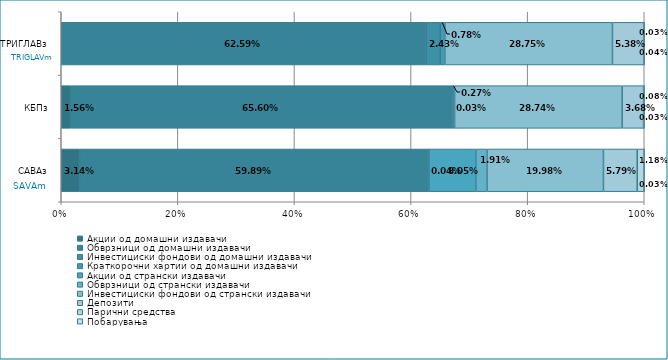
| Category | Акции од домашни издавачи  | Обврзници од домашни издавачи  | Инвестициски фондови од домашни издавачи  | Краткорочни хартии од домашни издавачи  | Акции од странски издавачи  | Обврзници од странски издавачи  | Инвестициски фондови од странски издавaчи | Депозити  | Парични средства  | Побарувања |
|---|---|---|---|---|---|---|---|---|---|---|
| САВАз | 0.031 | 0.599 | 0 | 0 | 0.08 | 0.019 | 0.2 | 0.058 | 0.012 | 0 |
| КБПз | 0.016 | 0.656 | 0 | 0 | 0 | 0.003 | 0.287 | 0.037 | 0.001 | 0 |
| ТРИГЛАВз | 0 | 0.626 | 0.024 | 0.008 | 0 | 0 | 0.287 | 0.054 | 0 | 0 |